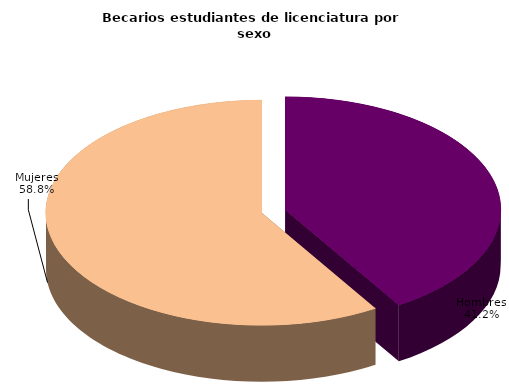
| Category | Series 0 |
|---|---|
| Hombres | 43585 |
| Mujeres | 62328 |